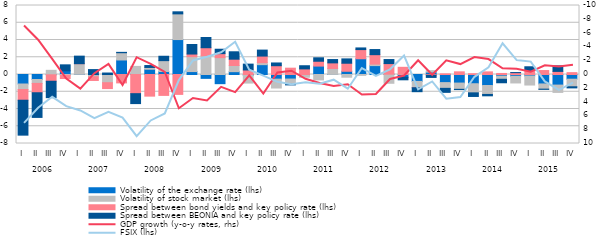
| Category | Volatility of the exchange rate (lhs) | Volatility of stock market (lhs) | Spread between bond yields and key policy rate (lhs) | Spread between BEONIA and key policy rate (lhs) |
|---|---|---|---|---|
| 0 | -1.102 | -0.635 | -1.247 | -4.048 |
| 1 | -0.581 | -0.451 | -1.085 | -2.859 |
| 2 | -0.035 | 0.484 | -0.748 | -1.9 |
| 3 | 0.423 | -0.093 | -0.376 | 0.697 |
| 4 | 0.016 | 1.231 | 0.007 | 0.874 |
| 5 | -0.124 | -0.139 | -0.428 | 0.569 |
| 6 | -0.07 | -0.881 | -0.682 | 0.171 |
| 7 | 1.683 | 0.842 | -0.974 | 0.042 |
| 8 | 0.054 | 0.885 | -2.223 | -1.15 |
| 9 | 0.609 | 0.207 | -2.509 | 0.223 |
| 10 | 0.344 | 1.263 | -2.424 | 0.508 |
| 11 | 4.051 | 2.979 | -2.305 | 0.238 |
| 12 | 0.34 | 1.734 | 0.298 | 1.107 |
| 13 | -0.447 | 2.175 | 0.929 | 1.187 |
| 14 | -1.064 | 1.954 | 0.465 | 0.511 |
| 15 | 0.328 | 0.717 | 0.73 | 0.859 |
| 16 | -0.11 | -0.886 | 0.523 | 0.68 |
| 17 | 1.141 | 0.228 | 0.767 | 0.694 |
| 18 | -0.539 | -1.028 | 1.019 | 0.318 |
| 19 | -0.528 | -0.605 | 0.732 | -0.072 |
| 20 | -0.071 | -0.247 | 0.65 | 0.366 |
| 21 | 0.974 | -0.627 | 0.562 | 0.4 |
| 22 | 0.006 | 0.687 | 0.654 | 0.387 |
| 23 | 0.375 | -0.314 | 0.931 | 0.502 |
| 24 | 1.825 | -0.102 | 1.062 | 0.192 |
| 25 | 1.031 | 0.175 | 1.093 | 0.593 |
| 26 | 0.036 | -1.015 | 1.229 | 0.469 |
| 27 | -0.32 | 0.027 | 0.806 | -0.295 |
| 28 | -0.803 | -0.728 | -0.001 | -0.461 |
| 29 | 0.277 | 0.168 | -0.087 | -0.251 |
| 30 | -0.941 | -0.665 | 0.078 | -0.465 |
| 31 | -0.993 | -0.726 | 0.31 | -0.03 |
| 32 | -1.07 | -1.059 | 0.086 | -0.417 |
| 33 | -1.277 | -1.035 | 0.305 | -0.159 |
| 34 | -0.189 | -0.366 | 0.121 | -0.403 |
| 35 | -0.206 | -0.776 | 0.215 | 0.009 |
| 36 | -0.172 | -1.049 | 0.48 | 0.416 |
| 37 | -1.096 | -0.602 | 0.459 | -0.021 |
| 38 | -1.228 | -0.849 | 0.359 | 0.647 |
| 39 | -0.545 | -0.877 | 0.217 | -0.13 |